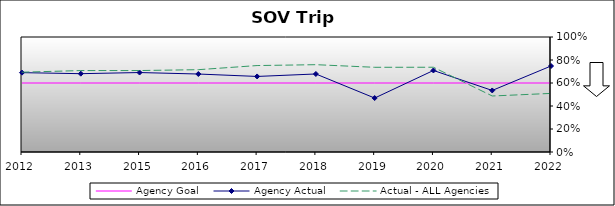
| Category | Agency Goal | Agency Actual | Actual - ALL Agencies |
|---|---|---|---|
| 2012.0 | 0.6 | 0.69 | 0.694 |
| 2013.0 | 0.6 | 0.681 | 0.708 |
| 2015.0 | 0.6 | 0.691 | 0.708 |
| 2016.0 | 0.6 | 0.678 | 0.716 |
| 2017.0 | 0.6 | 0.657 | 0.752 |
| 2018.0 | 0.6 | 0.678 | 0.759 |
| 2019.0 | 0.6 | 0.469 | 0.736 |
| 2020.0 | 0.6 | 0.709 | 0.737 |
| 2021.0 | 0.6 | 0.535 | 0.487 |
| 2022.0 | 0.6 | 0.748 | 0.509 |